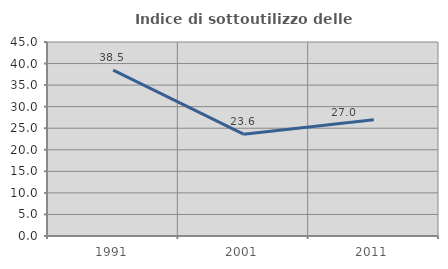
| Category | Indice di sottoutilizzo delle abitazioni  |
|---|---|
| 1991.0 | 38.462 |
| 2001.0 | 23.624 |
| 2011.0 | 26.98 |